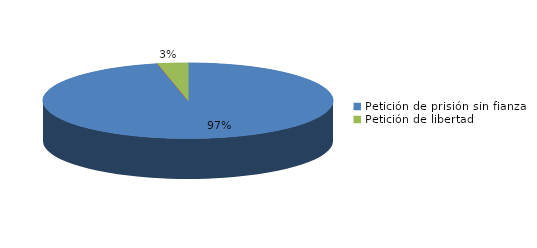
| Category | Series 0 |
|---|---|
| Petición de prisión sin fianza | 343 |
| Peticion de libertad con fianza | 0 |
| Petición de libertad | 12 |